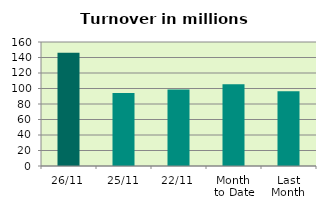
| Category | Series 0 |
|---|---|
| 26/11 | 146.289 |
| 25/11 | 94.067 |
| 22/11 | 98.656 |
| Month 
to Date | 105.386 |
| Last
Month | 96.433 |